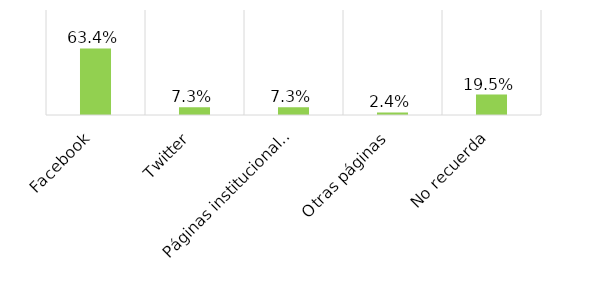
| Category | Series 0 |
|---|---|
| Facebook | 0.634 |
| Twitter | 0.073 |
| Páginas institucionales | 0.073 |
| Otras páginas | 0.024 |
| No recuerda | 0.195 |